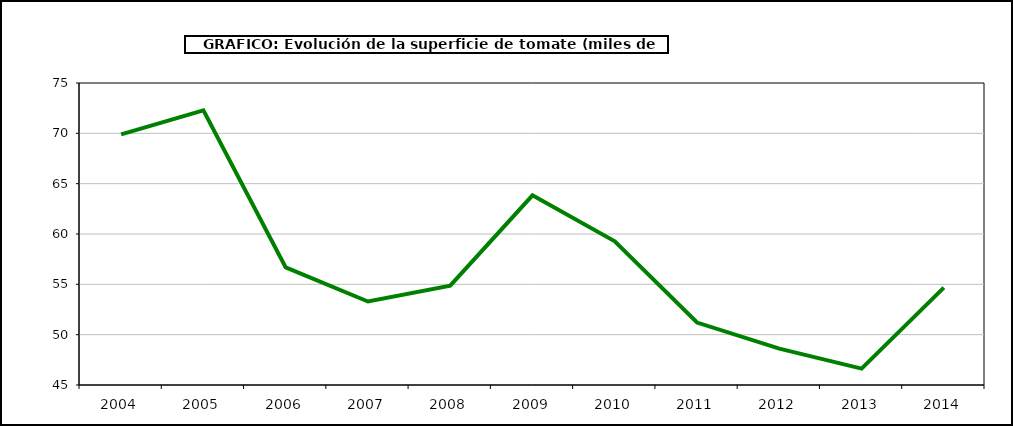
| Category | superficie |
|---|---|
| 2004.0 | 69.902 |
| 2005.0 | 72.285 |
| 2006.0 | 56.69 |
| 2007.0 | 53.297 |
| 2008.0 | 54.868 |
| 2009.0 | 63.838 |
| 2010.0 | 59.267 |
| 2011.0 | 51.204 |
| 2012.0 | 48.617 |
| 2013.0 | 46.623 |
| 2014.0 | 54.675 |